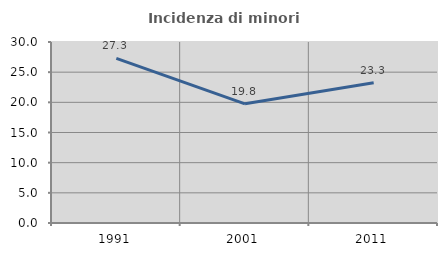
| Category | Incidenza di minori stranieri |
|---|---|
| 1991.0 | 27.273 |
| 2001.0 | 19.753 |
| 2011.0 | 23.256 |